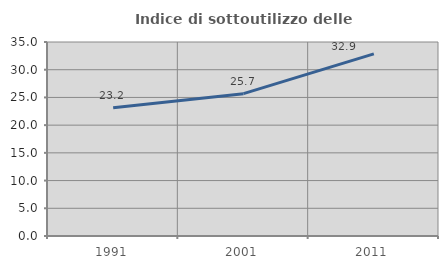
| Category | Indice di sottoutilizzo delle abitazioni  |
|---|---|
| 1991.0 | 23.158 |
| 2001.0 | 25.681 |
| 2011.0 | 32.851 |